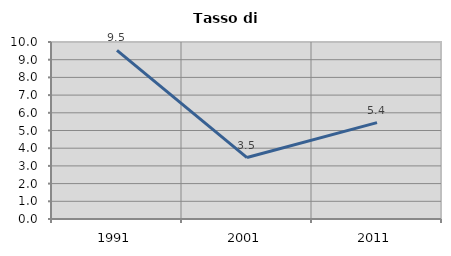
| Category | Tasso di disoccupazione   |
|---|---|
| 1991.0 | 9.524 |
| 2001.0 | 3.472 |
| 2011.0 | 5.442 |